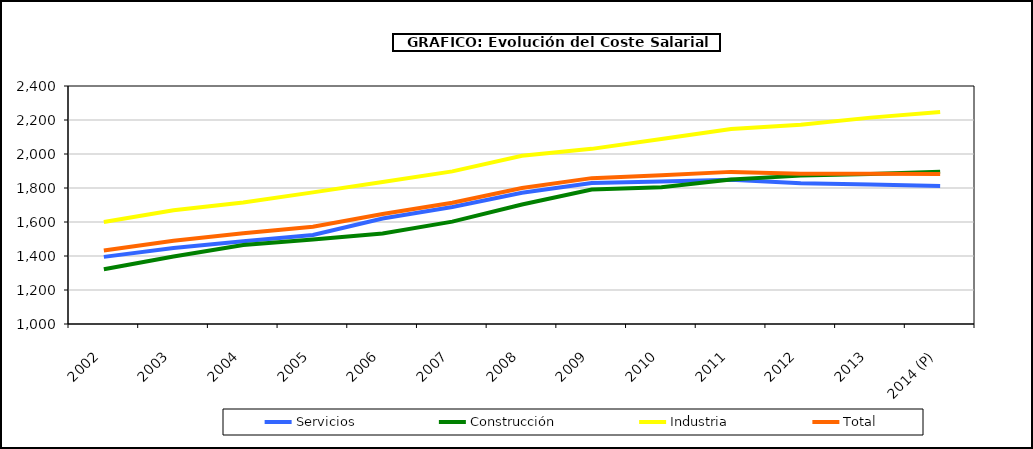
| Category | Servicios | Construcción | Industria | Total |
|---|---|---|---|---|
|  2002 | 1394.82 | 1321.782 | 1599.577 | 1432.252 |
|  2003 | 1447.032 | 1396.555 | 1668.615 | 1490.318 |
|  2004 | 1486.84 | 1464.175 | 1715.052 | 1533.81 |
|  2005 | 1524.1 | 1496.465 | 1774.282 | 1571.99 |
|  2006 | 1620.663 | 1532.018 | 1835.688 | 1646.96 |
|  2007 | 1688.575 | 1602.058 | 1897.902 | 1713.16 |
|  2008 | 1772.288 | 1703.245 | 1989.208 | 1800.028 |
|  2009 | 1829.705 | 1791.185 | 2030.235 | 1857.978 |
|  2010 | 1838.732 | 1804.735 | 2088.605 | 1875.23 |
|  2011 | 1848.135 | 1849.53 | 2147.29 | 1894.842 |
|  2012 | 1827.48 | 1872.792 | 2172.148 | 1883.54 |
|  2013 | 1820.002 | 1882.945 | 2214.01 | 1883.76 |
|  2014 (P) | 1811.798 | 1895.448 | 2247.635 | 1881.91 |